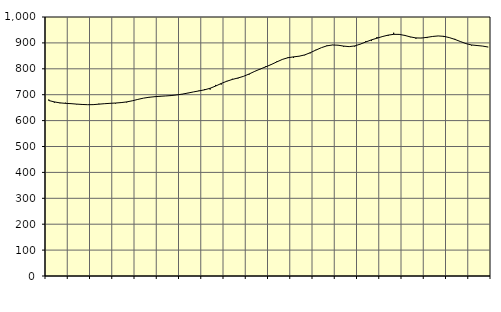
| Category | Piggar | Series 1 |
|---|---|---|
| nan | 681.4 | 677.5 |
| 1.0 | 669.4 | 672.19 |
| 1.0 | 667.3 | 668.44 |
| 1.0 | 668.9 | 666.61 |
| nan | 665 | 665.43 |
| 2.0 | 662.6 | 663.72 |
| 2.0 | 664 | 662.31 |
| 2.0 | 661.3 | 661.38 |
| nan | 660.5 | 661.67 |
| 3.0 | 665.2 | 663.46 |
| 3.0 | 665.6 | 665.22 |
| 3.0 | 666.4 | 666.65 |
| nan | 666.1 | 667.89 |
| 4.0 | 670.3 | 669.51 |
| 4.0 | 670.3 | 672.23 |
| 4.0 | 676.6 | 676.34 |
| nan | 682.3 | 681.81 |
| 5.0 | 686.6 | 686.63 |
| 5.0 | 691.2 | 689.92 |
| 5.0 | 691.1 | 692.16 |
| nan | 694.8 | 693.86 |
| 6.0 | 695.3 | 695.15 |
| 6.0 | 694.9 | 696.68 |
| 6.0 | 699.8 | 699.03 |
| nan | 701.2 | 702.3 |
| 7.0 | 706.9 | 706.27 |
| 7.0 | 710.8 | 710.67 |
| 7.0 | 715.9 | 714.65 |
| nan | 721.5 | 718.8 |
| 8.0 | 719.8 | 724.88 |
| 8.0 | 737.7 | 733.46 |
| 8.0 | 739.1 | 743.34 |
| nan | 753.2 | 751.91 |
| 9.0 | 761.4 | 758.96 |
| 9.0 | 762.8 | 764.5 |
| 9.0 | 771.2 | 770.85 |
| nan | 777.4 | 779.86 |
| 10.0 | 791 | 789.93 |
| 10.0 | 798.3 | 799.03 |
| 10.0 | 809.9 | 807.45 |
| nan | 814.9 | 816.57 |
| 11.0 | 828.6 | 826.72 |
| 11.0 | 835.6 | 836.32 |
| 11.0 | 844.8 | 842.81 |
| nan | 842.1 | 846.08 |
| 12.0 | 848.1 | 848.64 |
| 12.0 | 852.4 | 853.58 |
| 12.0 | 859.8 | 862.12 |
| nan | 873.3 | 872.1 |
| 13.0 | 881.5 | 881.57 |
| 13.0 | 890.4 | 888.65 |
| 13.0 | 892.4 | 891.92 |
| nan | 891.6 | 891.11 |
| 14.0 | 885.4 | 887.68 |
| 14.0 | 885.7 | 885.59 |
| 14.0 | 886 | 888.34 |
| nan | 895.7 | 895.21 |
| 15.0 | 907 | 903.62 |
| 15.0 | 907.2 | 911.62 |
| 15.0 | 922.7 | 918.16 |
| nan | 926.2 | 924.61 |
| 16.0 | 927.4 | 929.96 |
| 16.0 | 939.2 | 933.08 |
| 16.0 | 931.5 | 932.9 |
| nan | 930.6 | 928.82 |
| 17.0 | 922.1 | 923.16 |
| 17.0 | 916.5 | 919.22 |
| 17.0 | 919.5 | 918.73 |
| nan | 918.7 | 921.46 |
| 18.0 | 924.3 | 924.86 |
| 18.0 | 927 | 926.85 |
| 18.0 | 922.6 | 925.38 |
| nan | 920 | 920.52 |
| 19.0 | 915.5 | 913.61 |
| 19.0 | 905.9 | 905.24 |
| 19.0 | 897.3 | 897.27 |
| nan | 890 | 892.07 |
| 20.0 | 891.5 | 889.89 |
| 20.0 | 887.9 | 887.71 |
| 20.0 | 884.3 | 883.98 |